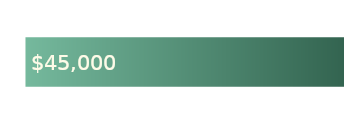
| Category | Total Assets | Padding |
|---|---|---|
| 0 | 45000 | 3600 |